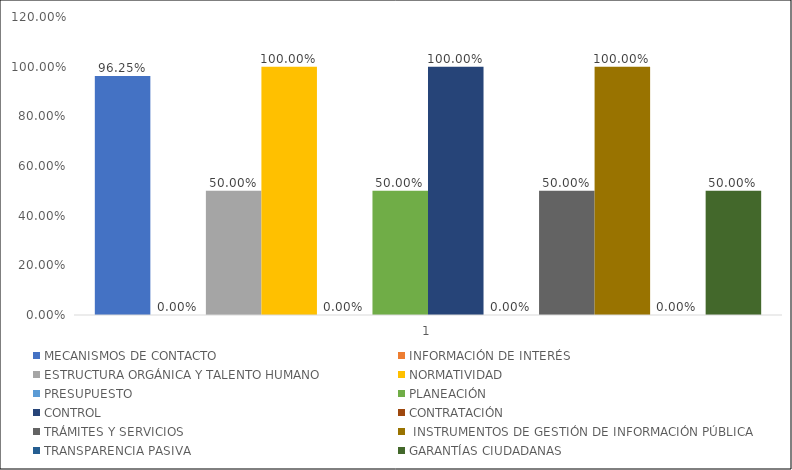
| Category | MECANISMOS DE CONTACTO  | INFORMACIÓN DE INTERÉS | ESTRUCTURA ORGÁNICA Y TALENTO HUMANO | NORMATIVIDAD | PRESUPUESTO | PLANEACIÓN | CONTROL | CONTRATACIÓN | TRÁMITES Y SERVICIOS |  INSTRUMENTOS DE GESTIÓN DE INFORMACIÓN PÚBLICA | TRANSPARENCIA PASIVA | GARANTÍAS CIUDADANAS |
|---|---|---|---|---|---|---|---|---|---|---|---|---|
| 0 | 0.963 | 0 | 0.5 | 1 | 0 | 0.5 | 1 | 0 | 0.5 | 1 | 0 | 0.5 |